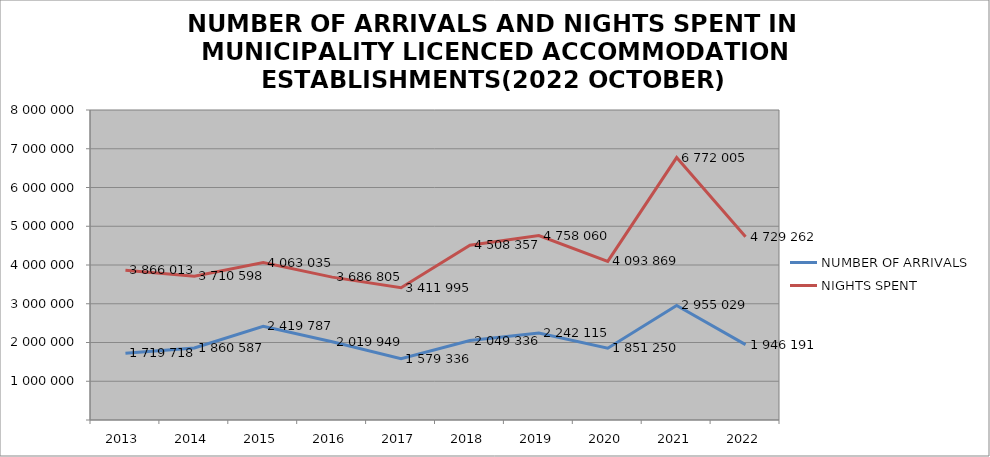
| Category | NUMBER OF ARRIVALS | NIGHTS SPENT |
|---|---|---|
| 2013 | 1719718 | 3866013 |
| 2014 | 1860587 | 3710598 |
| 2015 | 2419787 | 4063035 |
| 2016 | 2019949 | 3686805 |
| 2017 | 1579336 | 3411995 |
| 2018 | 2049336 | 4508357 |
| 2019 | 2242115 | 4758060 |
| 2020 | 1851250 | 4093869 |
| 2021 | 2955029 | 6772005 |
| 2022 | 1946191 | 4729262 |